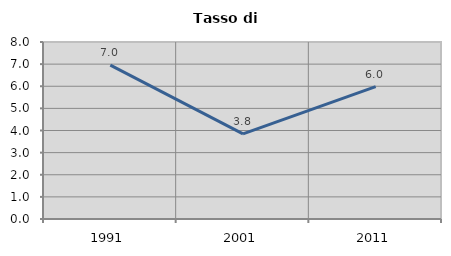
| Category | Tasso di disoccupazione   |
|---|---|
| 1991.0 | 6.954 |
| 2001.0 | 3.846 |
| 2011.0 | 5.983 |